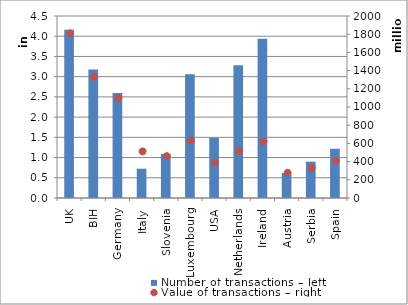
| Category | Number of transactions – left |
|---|---|
| UK | 4162374 |
| BIH | 3174629 |
| Germany | 2598307 |
| Italy | 724113 |
| Slovenia | 1088026 |
| Luxembourg | 3057329 |
| USA | 1487918 |
| Netherlands | 3281835 |
| Ireland | 3935478 |
| Austria | 618023 |
| Serbia | 898111 |
| Spain | 1216696 |